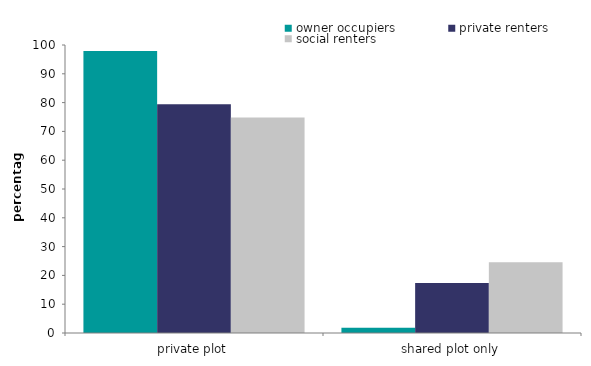
| Category | owner occupiers | private renters | social renters |
|---|---|---|---|
| private plot | 97.915 | 79.462 | 74.819 |
| shared plot only | 1.803 | 17.353 | 24.54 |